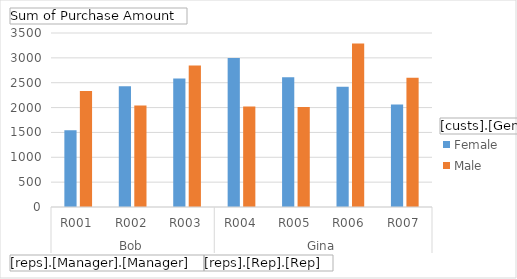
| Category | Female | Male |
|---|---|---|
| 0 | 1545 | 2335 |
| 1 | 2430 | 2040 |
| 2 | 2585 | 2845 |
| 3 | 2995 | 2020 |
| 4 | 2610 | 2010 |
| 5 | 2420 | 3290 |
| 6 | 2060 | 2600 |